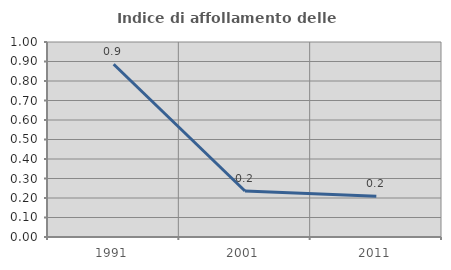
| Category | Indice di affollamento delle abitazioni  |
|---|---|
| 1991.0 | 0.886 |
| 2001.0 | 0.236 |
| 2011.0 | 0.209 |